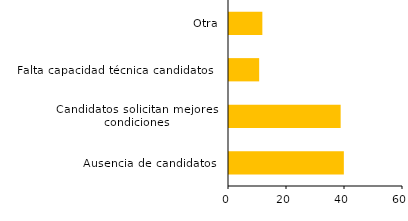
| Category | Series 0 |
|---|---|
| Ausencia de candidatos | 39.6 |
| Candidatos solicitan mejores condiciones | 38.5 |
| Falta capacidad técnica candidatos | 10.4 |
| Otra | 11.5 |